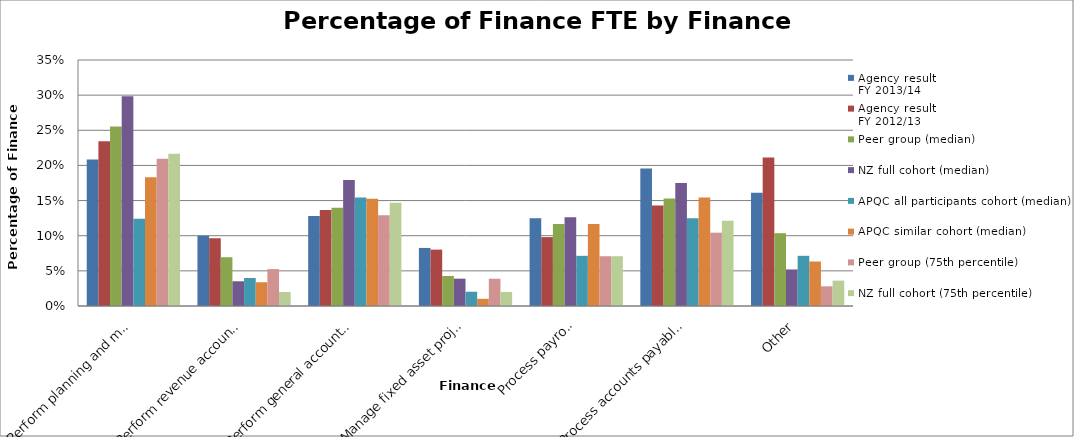
| Category | Agency result
FY 2013/14 | Agency result
FY 2012/13 | Peer group (median) | NZ full cohort (median) | APQC all participants cohort (median) | APQC similar cohort (median) | Peer group (75th percentile) | NZ full cohort (75th percentile) |
|---|---|---|---|---|---|---|---|---|
| Perform planning and management accounting | 0.209 | 0.234 | 0.255 | 0.298 | 0.124 | 0.183 | 0.21 | 0.217 |
| Perform revenue accounting | 0.1 | 0.096 | 0.069 | 0.035 | 0.04 | 0.034 | 0.052 | 0.02 |
| Perform general accounting and reporting | 0.128 | 0.137 | 0.14 | 0.179 | 0.154 | 0.152 | 0.129 | 0.147 |
| Manage fixed asset project accounting | 0.083 | 0.08 | 0.043 | 0.039 | 0.02 | 0.01 | 0.039 | 0.02 |
| Process payroll | 0.125 | 0.098 | 0.117 | 0.126 | 0.071 | 0.117 | 0.071 | 0.071 |
| Process accounts payable and expense reimbursements | 0.196 | 0.143 | 0.153 | 0.175 | 0.125 | 0.154 | 0.104 | 0.121 |
| Other | 0.161 | 0.211 | 0.104 | 0.052 | 0.071 | 0.063 | 0.028 | 0.036 |